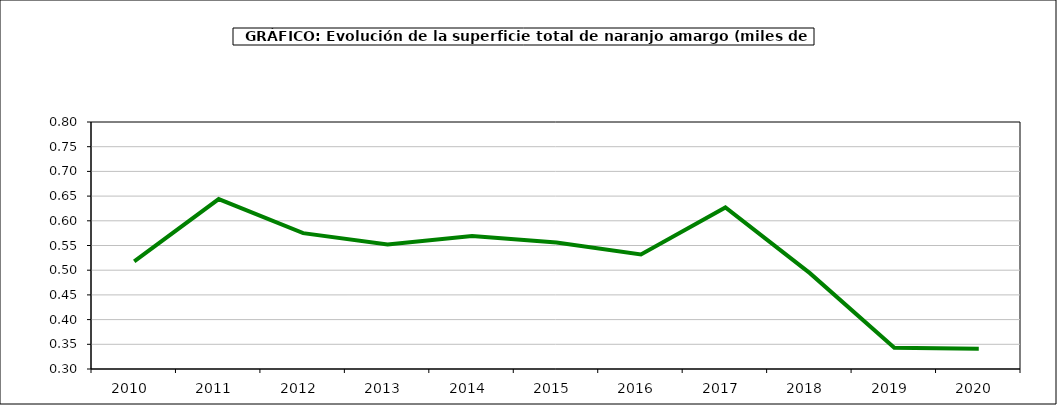
| Category | superficie |
|---|---|
| 2010.0 | 0.518 |
| 2011.0 | 0.644 |
| 2012.0 | 0.575 |
| 2013.0 | 0.552 |
| 2014.0 | 0.569 |
| 2015.0 | 0.556 |
| 2016.0 | 0.532 |
| 2017.0 | 0.627 |
| 2018.0 | 0.494 |
| 2019.0 | 0.343 |
| 2020.0 | 0.341 |